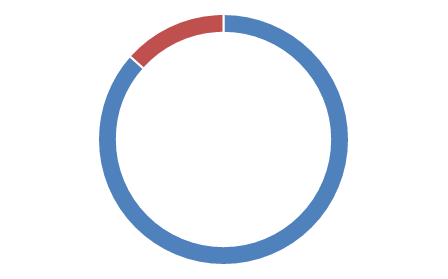
| Category | Series 0 |
|---|---|
| 0 | 58 |
| 1 | 9 |